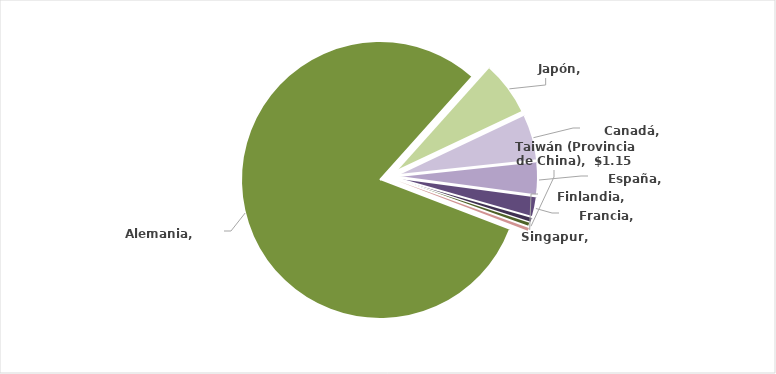
| Category | Series 0 |
|---|---|
| Alemania | 196.882 |
| Japón | 15.462 |
| Canadá | 13.051 |
| España | 9.251 |
| Francia | 5.683 |
| Singapur | 1.377 |
| Taiwán (Provincia de China) | 1.146 |
| Finlandia | 0.857 |